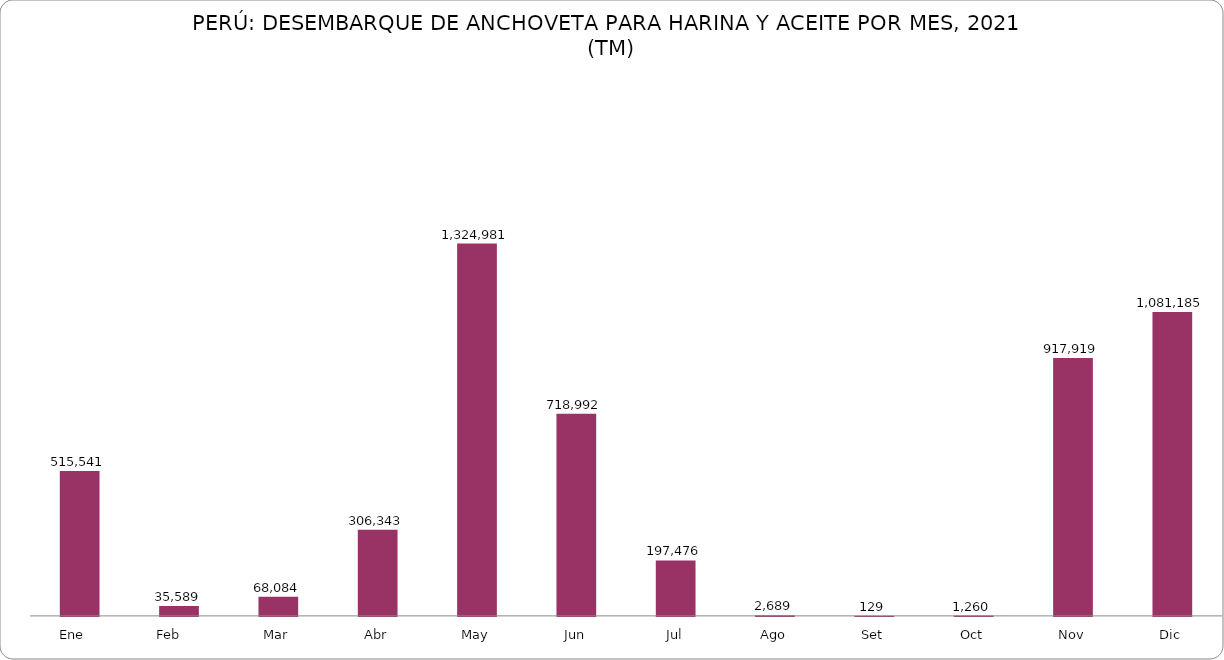
| Category | Series 0 |
|---|---|
| Ene    | 515540.899 |
| Feb     | 35589.427 |
| Mar | 68083.633 |
| Abr | 306343.475 |
| May | 1324980.655 |
| Jun | 718992.249 |
| Jul | 197475.73 |
| Ago | 2689.467 |
| Set | 128.828 |
| Oct | 1260.316 |
| Nov | 917919.23 |
| Dic | 1081185.456 |